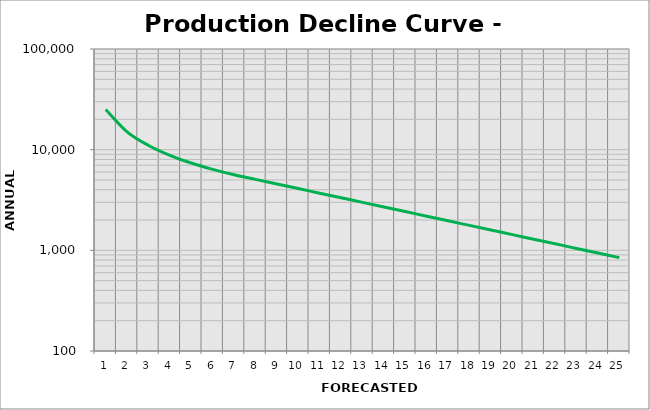
| Category | Series 1 |
|---|---|
| 0 | 25091.578 |
| 1 | 15020.737 |
| 2 | 11009.964 |
| 3 | 8793.501 |
| 4 | 7370.554 |
| 5 | 6372.884 |
| 6 | 5631.275 |
| 7 | 5066.487 |
| 8 | 4565.037 |
| 9 | 4108.533 |
| 10 | 3697.68 |
| 11 | 3327.912 |
| 12 | 2995.121 |
| 13 | 2695.609 |
| 14 | 2426.048 |
| 15 | 2183.443 |
| 16 | 1965.099 |
| 17 | 1768.589 |
| 18 | 1591.73 |
| 19 | 1432.557 |
| 20 | 1289.301 |
| 21 | 1160.371 |
| 22 | 1044.334 |
| 23 | 939.901 |
| 24 | 845.911 |